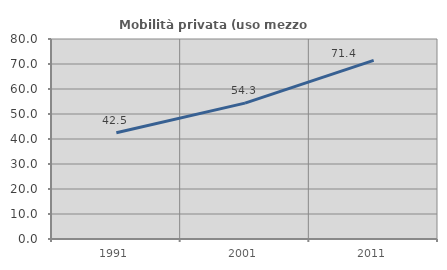
| Category | Mobilità privata (uso mezzo privato) |
|---|---|
| 1991.0 | 42.5 |
| 2001.0 | 54.348 |
| 2011.0 | 71.429 |